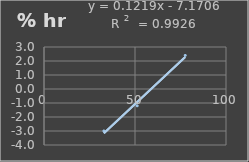
| Category | Humedad |
|---|---|
| 32.9 | -3 |
| 51.2 | -1.2 |
| 77.6 | 2.4 |